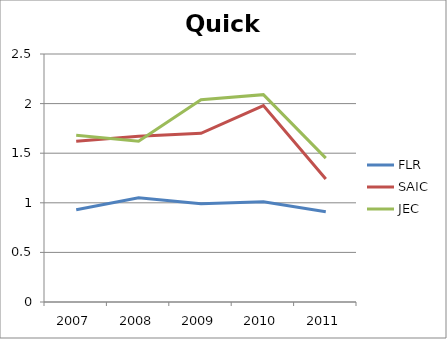
| Category | FLR | SAIC | JEC |
|---|---|---|---|
| 2007.0 | 0.93 | 1.62 | 1.68 |
| 2008.0 | 1.05 | 1.67 | 1.62 |
| 2009.0 | 0.99 | 1.7 | 2.04 |
| 2010.0 | 1.01 | 1.98 | 2.09 |
| 2011.0 | 0.91 | 1.24 | 1.45 |